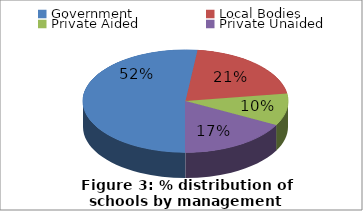
| Category | Series 0 |
|---|---|
| Government | 730205 |
| Local Bodies | 292342 |
| Private Aided | 142101 |
| Private Unaided | 242995 |